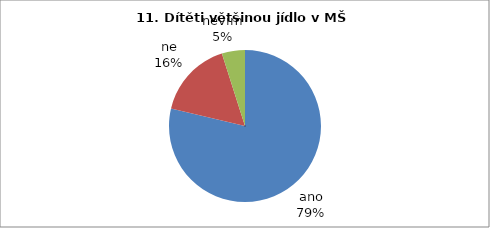
| Category | 11. Dítěti většinou jídlo v MŠ chutná. |
|---|---|
| ano | 48 |
| ne | 10 |
| nevím | 3 |